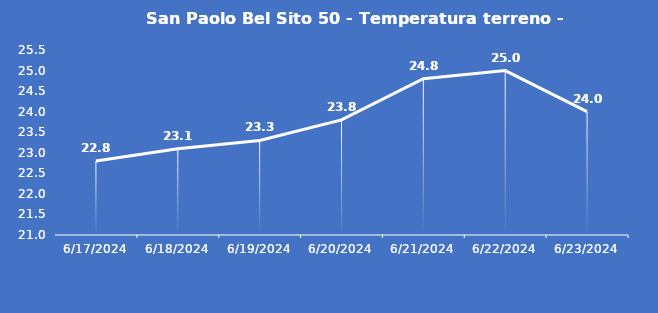
| Category | San Paolo Bel Sito 50 - Temperatura terreno - Grezzo (°C) |
|---|---|
| 6/17/24 | 22.8 |
| 6/18/24 | 23.1 |
| 6/19/24 | 23.3 |
| 6/20/24 | 23.8 |
| 6/21/24 | 24.8 |
| 6/22/24 | 25 |
| 6/23/24 | 24 |